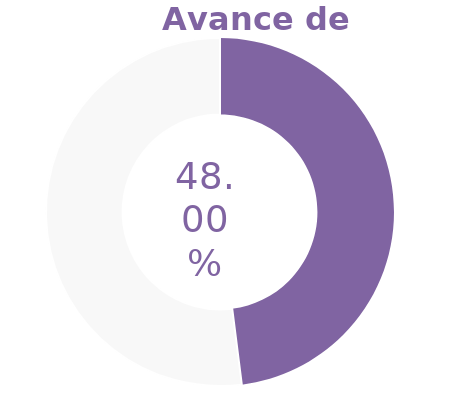
| Category | Series 0 |
|---|---|
| Acumulado 1 Trimestre | 0.48 |
| Año | -0.52 |